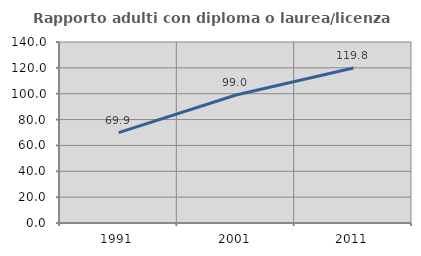
| Category | Rapporto adulti con diploma o laurea/licenza media  |
|---|---|
| 1991.0 | 69.85 |
| 2001.0 | 99 |
| 2011.0 | 119.847 |